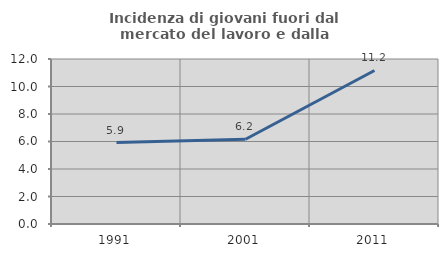
| Category | Incidenza di giovani fuori dal mercato del lavoro e dalla formazione  |
|---|---|
| 1991.0 | 5.922 |
| 2001.0 | 6.162 |
| 2011.0 | 11.167 |